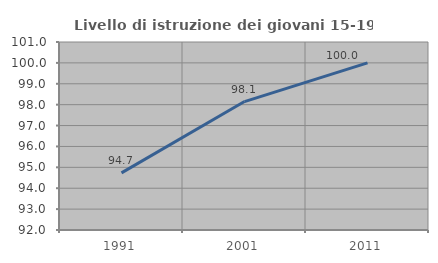
| Category | Livello di istruzione dei giovani 15-19 anni |
|---|---|
| 1991.0 | 94.737 |
| 2001.0 | 98.148 |
| 2011.0 | 100 |